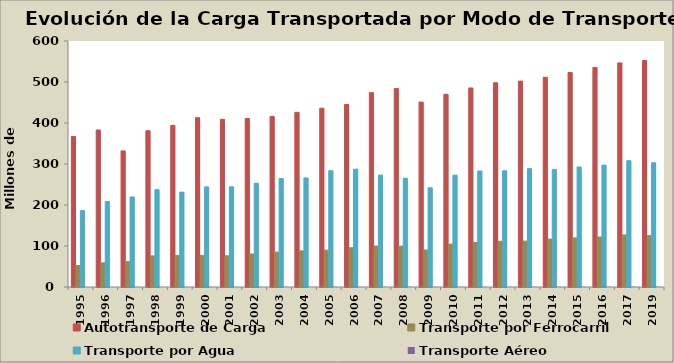
| Category | Autotransporte de Carga | Transporte por Ferrocarril | Transporte por Agua | Transporte Aéreo |
|---|---|---|---|---|
| 1995.0 | 367 | 52.48 | 186.26 | 0.252 |
| 1996.0 | 383 | 58.831 | 208.581 | 0.285 |
| 1997.0 | 332 | 61.666 | 219.653 | 0.335 |
| 1998.0 | 381 | 75.914 | 237.38 | 0.388 |
| 1999.0 | 394 | 77.062 | 231.44 | 0.407 |
| 2000.0 | 413 | 77.164 | 244.252 | 0.379 |
| 2001.0 | 409 | 76.182 | 244.431 | 0.351 |
| 2002.0 | 411 | 80.451 | 253.046 | 0.389 |
| 2003.0 | 416 | 85.168 | 264.739 | 0.41 |
| 2004.0 | 426 | 88.097 | 266.008 | 0.467 |
| 2005.0 | 436 | 89.814 | 283.604 | 0.529 |
| 2006.0 | 445 | 95.713 | 287.432 | 0.544 |
| 2007.0 | 474 | 99.845 | 272.934 | 0.572 |
| 2008.0 | 484 | 99.692 | 265.237 | 0.525 |
| 2009.0 | 451 | 90.321 | 241.923 | 0.466 |
| 2010.0 | 470 | 104.564 | 272.811 | 0.571 |
| 2011.0 | 485.502 | 108.433 | 282.902 | 0.562 |
| 2012.0 | 498.147 | 111.607 | 283.462 | 0.559 |
| 2013.0 | 502.15 | 111.933 | 288.696 | 0.582 |
| 2014.0 | 511.34 | 116.936 | 286.761 | 0.618 |
| 2015.0 | 522.99 | 119.646 | 292.646 | 0.655 |
| 2016.0 | 535.548 | 121.968 | 297.199 | 0.685 |
| 2017.0 | 546.588 | 126.875 | 308.089 | 0.74 |
| 2019.0 | 552.318 | 125.185 | 302.931 | 0.774 |